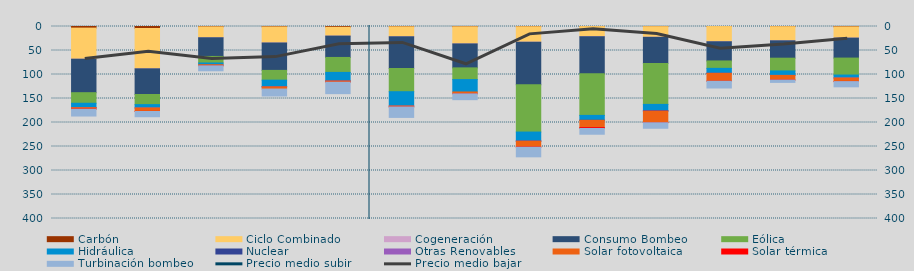
| Category | Carbón | Ciclo Combinado | Cogeneración | Consumo Bombeo | Eólica | Hidráulica | Nuclear | Otras Renovables | Solar fotovoltaica | Solar térmica | Turbinación bombeo |
|---|---|---|---|---|---|---|---|---|---|---|---|
| A | 3351.92 | 64804.475 | 20.75 | 69703.55 | 22031.853 | 9149.525 | 70.975 | 22.5 | 2685.85 | 505.375 | 14186.525 |
| S | 4138.5 | 84055.788 | 26 | 53462.35 | 21071.172 | 6988.753 | 0 | 0.85 | 7069.199 | 219.625 | 10948.251 |
| O | 766.425 | 22723.1 | 23.25 | 38873.508 | 13638.3 | 3548.975 | 0 | 0 | 2254.075 | 15.75 | 10421.953 |
| N | 882.249 | 33437.299 | 73.35 | 57054.7 | 20324.708 | 13802.882 | 172 | 5.375 | 4519.267 | 0 | 14514.075 |
| D | 1625.533 | 18353.308 | 50.675 | 44452.158 | 31169.809 | 17718.259 | 225.525 | 7.75 | 2457.35 | 4.225 | 23848.4 |
| E | 624.15 | 20714.774 | 137.817 | 66005.482 | 48358.133 | 29783.675 | 0 | 1 | 1942.858 | 28.625 | 21792.308 |
| F | 573.3 | 35710.625 | 48.25 | 49890.275 | 24355.325 | 25831 | 0 | 0 | 3780.125 | 69.225 | 12196.8 |
| M | 501.25 | 32124.392 | 164.517 | 88685.498 | 98417.968 | 18612.512 | 448.75 | 16.575 | 11880.15 | 572.625 | 20112.843 |
| A | 170 | 20766.184 | 571.725 | 76937.455 | 86761.121 | 10133.333 | 40.925 | 0 | 14988.025 | 2004.65 | 12082.525 |
| M | 320.375 | 21993.7 | 252.925 | 54297.65 | 85403.658 | 12766.317 | 1357.65 | 14.475 | 23573.033 | 453.85 | 11577.425 |
| J | 92.075 | 31710.184 | 28.017 | 39954.501 | 15416.333 | 10344.86 | 11.25 | 38.75 | 16255.675 | 192.1 | 14074.425 |
| J | 322.925 | 29487.87 | 56.5 | 36148.45 | 26555.431 | 9322.947 | 0 | 27.5 | 9428.357 | 218.775 | 4884.775 |
| A | 791.025 | 23383.803 | 61.5 | 41567.115 | 35359.804 | 6042.439 | 0 | 145.075 | 7086.59 | 334.925 | 10897.775 |